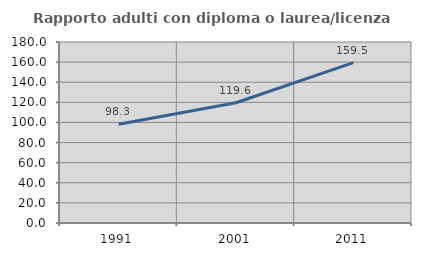
| Category | Rapporto adulti con diploma o laurea/licenza media  |
|---|---|
| 1991.0 | 98.286 |
| 2001.0 | 119.574 |
| 2011.0 | 159.515 |